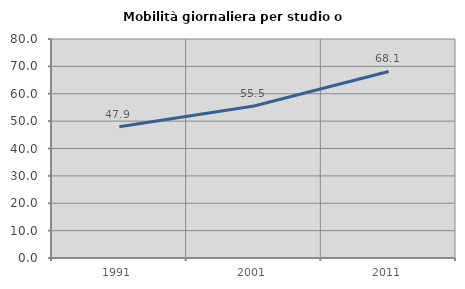
| Category | Mobilità giornaliera per studio o lavoro |
|---|---|
| 1991.0 | 47.941 |
| 2001.0 | 55.548 |
| 2011.0 | 68.149 |